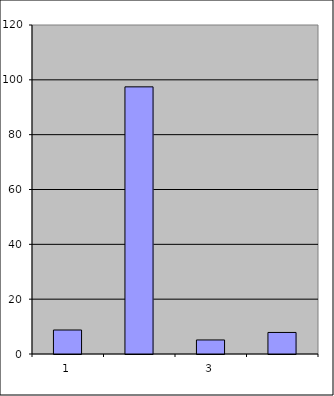
| Category | Series 0 |
|---|---|
| 0 | 8.75 |
| 1 | 97.441 |
| 2 | 5.118 |
| 3 | 7.856 |